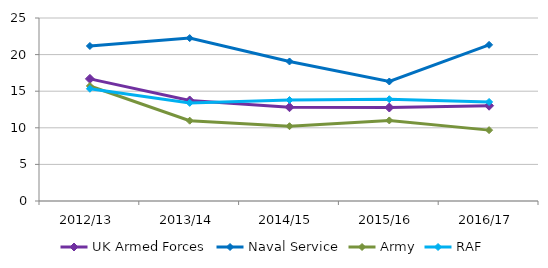
| Category | UK Armed Forces | Naval Service | Army | RAF |
|---|---|---|---|---|
| 2012/13 | 16.684 | 21.178 | 15.714 | 15.329 |
| 2013/14 | 13.733 | 22.256 | 10.971 | 13.401 |
| 2014/15 | 12.811 | 19.061 | 10.214 | 13.796 |
| 2015/16 | 12.77 | 16.326 | 11.005 | 13.903 |
| 2016/17 | 13.018 | 21.331 | 9.682 | 13.531 |